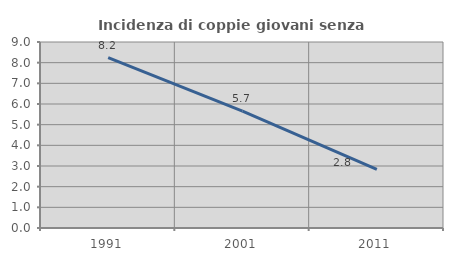
| Category | Incidenza di coppie giovani senza figli |
|---|---|
| 1991.0 | 8.249 |
| 2001.0 | 5.66 |
| 2011.0 | 2.84 |